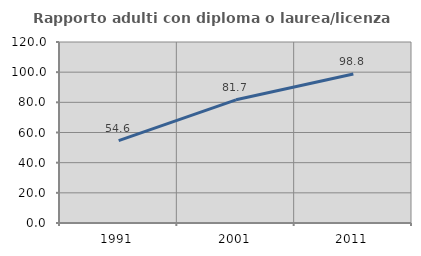
| Category | Rapporto adulti con diploma o laurea/licenza media  |
|---|---|
| 1991.0 | 54.618 |
| 2001.0 | 81.675 |
| 2011.0 | 98.783 |